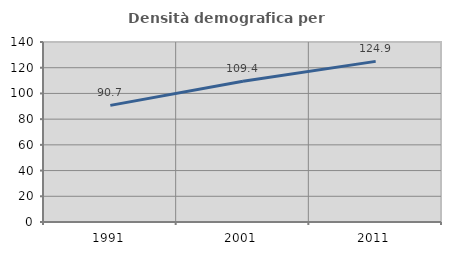
| Category | Densità demografica |
|---|---|
| 1991.0 | 90.725 |
| 2001.0 | 109.42 |
| 2011.0 | 124.926 |